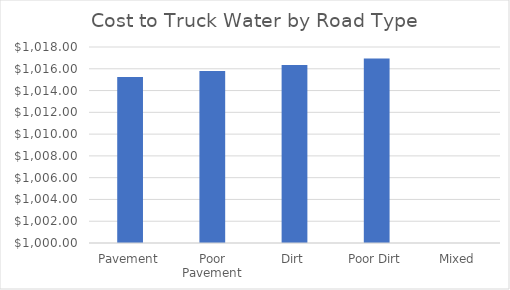
| Category | Series 0 |
|---|---|
| Pavement | 1015.234 |
| Poor Pavement | 1015.786 |
| Dirt | 1016.344 |
| Poor Dirt | 1016.954 |
| Mixed | 0 |